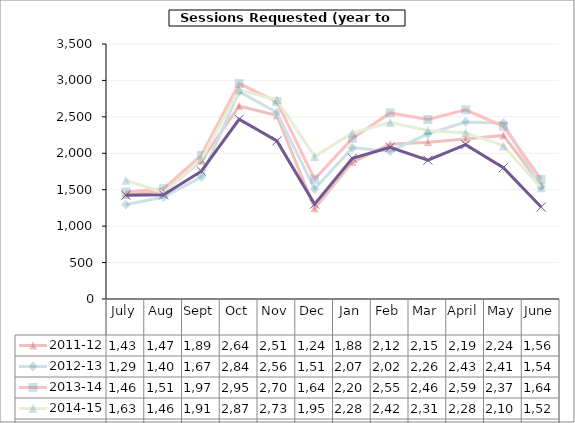
| Category | 2011-12 | 2012-13 | 2013-14 | 2014-15 | 2015-16 |
|---|---|---|---|---|---|
| July | 1430 | 1295 | 1469 | 1630 | 1424 |
| Aug | 1479 | 1400 | 1514 | 1460 | 1430 |
| Sept | 1897 | 1675 | 1973 | 1916 | 1754 |
| Oct | 2649 | 2846 | 2957 | 2873 | 2467 |
| Nov | 2519 | 2560 | 2709 | 2734 | 2169 |
| Dec | 1244 | 1511 | 1646 | 1956 | 1302 |
| Jan | 1880 | 2075 | 2204 | 2280 | 1932 |
| Feb | 2124 | 2027 | 2554 | 2423 | 2082 |
| Mar | 2152 | 2267 | 2464 | 2313 | 1905 |
| April | 2197 | 2430 | 2597 | 2283 | 2118 |
| May | 2245 | 2414 | 2371 | 2103 | 1803 |
| June | 1561 | 1548 | 1643 | 1528 | 1262 |